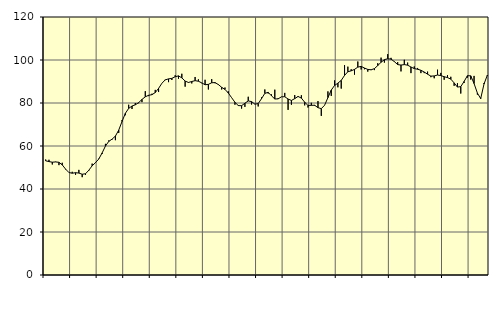
| Category | Piggar | Series 1 |
|---|---|---|
| nan | 53.7 | 53.11 |
| 87.0 | 53.6 | 52.75 |
| 87.0 | 51.4 | 52.47 |
| 87.0 | 52.7 | 52.59 |
| nan | 51.1 | 52.42 |
| 88.0 | 52.2 | 51.21 |
| 88.0 | 49.1 | 49.26 |
| 88.0 | 47.6 | 47.66 |
| nan | 48 | 47.34 |
| 89.0 | 46.6 | 47.58 |
| 89.0 | 48.9 | 47.41 |
| 89.0 | 45.5 | 46.87 |
| nan | 46.6 | 47.09 |
| 90.0 | 48.5 | 48.74 |
| 90.0 | 51.8 | 50.79 |
| 90.0 | 52.1 | 52.25 |
| nan | 54.1 | 53.95 |
| 91.0 | 56.3 | 56.77 |
| 91.0 | 61 | 59.95 |
| 91.0 | 62.6 | 62.14 |
| nan | 63 | 63.2 |
| 92.0 | 62.7 | 64.6 |
| 92.0 | 66.1 | 67.39 |
| 92.0 | 72.1 | 71.39 |
| nan | 74.3 | 75.21 |
| 93.0 | 79.2 | 77.5 |
| 93.0 | 77.2 | 78.6 |
| 93.0 | 80 | 79.16 |
| nan | 79.9 | 80.17 |
| 94.0 | 80.4 | 81.65 |
| 94.0 | 85.5 | 82.88 |
| 94.0 | 83.2 | 83.59 |
| nan | 84.3 | 83.87 |
| 95.0 | 86.1 | 84.85 |
| 95.0 | 85.1 | 86.79 |
| 95.0 | 89.2 | 89.17 |
| nan | 90.9 | 90.75 |
| 96.0 | 89.7 | 91.22 |
| 96.0 | 90.7 | 91.46 |
| 96.0 | 92.9 | 92.21 |
| nan | 91.3 | 92.62 |
| 97.0 | 93.6 | 91.69 |
| 97.0 | 87.6 | 90.2 |
| 97.0 | 89.7 | 89.55 |
| nan | 89.1 | 90 |
| 98.0 | 92.1 | 90.39 |
| 98.0 | 91 | 90.12 |
| 98.0 | 89.2 | 89.36 |
| nan | 90.8 | 88.49 |
| 99.0 | 86.3 | 88.67 |
| 99.0 | 91.1 | 89.41 |
| 99.0 | 89.2 | 89.5 |
| nan | 88.4 | 88.58 |
| 0.0 | 86.3 | 87.29 |
| 0.0 | 87.2 | 86.32 |
| 0.0 | 85.4 | 84.65 |
| nan | 82.5 | 82.47 |
| 1.0 | 79.2 | 80.34 |
| 1.0 | 79 | 78.79 |
| 1.0 | 77.4 | 78.75 |
| nan | 78.2 | 79.91 |
| 2.0 | 82.9 | 80.96 |
| 2.0 | 79.3 | 80.65 |
| 2.0 | 79.6 | 79.46 |
| nan | 78.4 | 79.72 |
| 3.0 | 82.6 | 82.02 |
| 3.0 | 86.3 | 84.48 |
| 3.0 | 84.4 | 84.96 |
| nan | 84 | 83.35 |
| 4.0 | 86.2 | 81.86 |
| 4.0 | 82.2 | 81.92 |
| 4.0 | 82.8 | 82.87 |
| nan | 84.7 | 82.92 |
| 5.0 | 76.8 | 81.85 |
| 5.0 | 79.2 | 81.19 |
| 5.0 | 83.7 | 82.03 |
| nan | 82.8 | 83.04 |
| 6.0 | 83.6 | 82.28 |
| 6.0 | 78.9 | 80.36 |
| 6.0 | 77.9 | 78.85 |
| nan | 80.1 | 78.91 |
| 7.0 | 78.7 | 78.96 |
| 7.0 | 80.9 | 77.83 |
| 7.0 | 74 | 77.37 |
| nan | 79 | 78.97 |
| 8.0 | 85.4 | 82.52 |
| 8.0 | 83.3 | 86.02 |
| 8.0 | 90.5 | 88.16 |
| nan | 87.3 | 89.24 |
| 9.0 | 86.7 | 90.51 |
| 9.0 | 97.6 | 92.83 |
| 9.0 | 96.9 | 94.53 |
| nan | 95.7 | 94.96 |
| 10.0 | 93.2 | 95.63 |
| 10.0 | 99.3 | 96.68 |
| 10.0 | 95.6 | 97.03 |
| nan | 95.7 | 96.26 |
| 11.0 | 94.6 | 95.62 |
| 11.0 | 95.3 | 95.45 |
| 11.0 | 95.3 | 95.99 |
| nan | 98.5 | 97.42 |
| 12.0 | 101.1 | 98.94 |
| 12.0 | 98.8 | 100.16 |
| 12.0 | 102.7 | 100.58 |
| nan | 101 | 100.41 |
| 13.0 | 99.1 | 99.25 |
| 13.0 | 99 | 97.86 |
| 13.0 | 94.7 | 97.64 |
| nan | 100.1 | 97.86 |
| 14.0 | 98.8 | 97.59 |
| 14.0 | 93.9 | 96.75 |
| 14.0 | 97 | 96 |
| nan | 96.3 | 95.7 |
| 15.0 | 93.9 | 95.22 |
| 15.0 | 93.9 | 94.41 |
| 15.0 | 94.6 | 93.4 |
| nan | 92 | 92.5 |
| 16.0 | 91.5 | 92.59 |
| 16.0 | 95.5 | 93.01 |
| 16.0 | 94 | 92.75 |
| nan | 90.8 | 92.23 |
| 17.0 | 93 | 91.82 |
| 17.0 | 92.2 | 91.11 |
| 17.0 | 88 | 89.35 |
| nan | 89.2 | 87.41 |
| 18.0 | 84.4 | 87.61 |
| 18.0 | 89.3 | 90.01 |
| 18.0 | 91.8 | 92.69 |
| nan | 90.9 | 92.64 |
| 19.0 | 92.6 | 89.06 |
| 19.0 | 83.9 | 84.62 |
| 19.0 | 82.4 | 82.06 |
| nan | 89.3 | 88.84 |
| 20.0 | 92.6 | 92.94 |